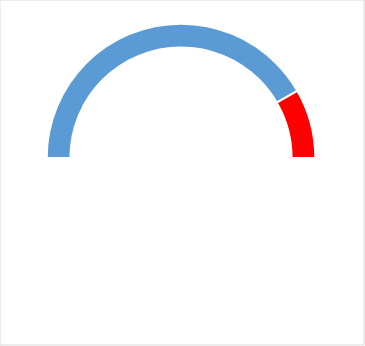
| Category | Series 0 | Series 1 |
|---|---|---|
| 0 | 180 |  |
| 1 | 150 |  |
| 2 | 30 |  |